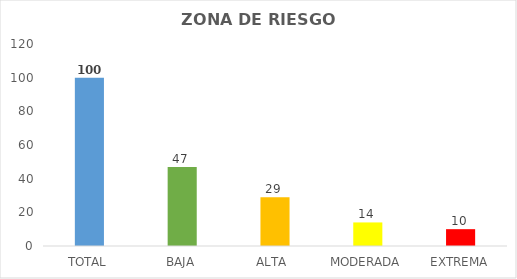
| Category | Series 0 |
|---|---|
| TOTAL | 100 |
| BAJA | 47 |
| ALTA  | 29 |
| MODERADA | 14 |
| EXTREMA | 10 |